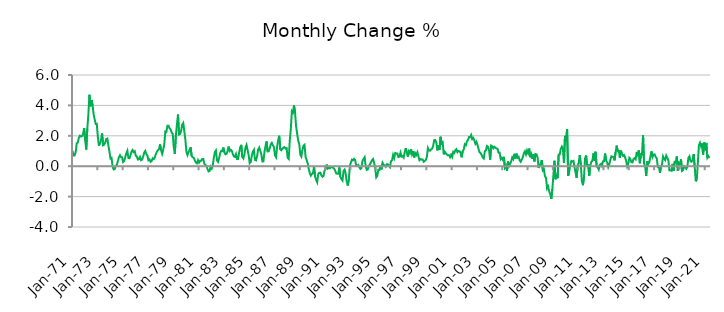
| Category | Series 0 |
|---|---|
| 1971-01-01 | 1.014 |
| 1971-02-01 | 0.711 |
| 1971-03-01 | 0.712 |
| 1971-04-01 | 0.919 |
| 1971-05-01 | 1.51 |
| 1971-06-01 | 1.551 |
| 1971-07-01 | 1.878 |
| 1971-08-01 | 2.005 |
| 1971-09-01 | 1.95 |
| 1971-10-01 | 1.987 |
| 1971-11-01 | 2.104 |
| 1971-12-01 | 2.509 |
| 1972-01-01 | 1.699 |
| 1972-02-01 | 1.094 |
| 1972-03-01 | 2.462 |
| 1972-04-01 | 3.36 |
| 1972-05-01 | 4.697 |
| 1972-06-01 | 3.937 |
| 1972-07-01 | 4.355 |
| 1972-08-01 | 4.026 |
| 1972-09-01 | 3.417 |
| 1972-10-01 | 3.088 |
| 1972-11-01 | 2.774 |
| 1972-12-01 | 2.784 |
| 1973-01-01 | 1.938 |
| 1973-02-01 | 1.343 |
| 1973-03-01 | 1.524 |
| 1973-04-01 | 1.712 |
| 1973-05-01 | 2.158 |
| 1973-06-01 | 1.373 |
| 1973-07-01 | 1.418 |
| 1973-08-01 | 1.551 |
| 1973-09-01 | 1.782 |
| 1973-10-01 | 1.816 |
| 1973-11-01 | 1.359 |
| 1973-12-01 | 0.961 |
| 1974-01-01 | 0.511 |
| 1974-02-01 | 0.548 |
| 1974-03-01 | -0.022 |
| 1974-04-01 | -0.216 |
| 1974-05-01 | -0.191 |
| 1974-06-01 | 0.007 |
| 1974-07-01 | 0.097 |
| 1974-08-01 | 0.326 |
| 1974-09-01 | 0.591 |
| 1974-10-01 | 0.722 |
| 1974-11-01 | 0.594 |
| 1974-12-01 | 0.583 |
| 1975-01-01 | 0.268 |
| 1975-02-01 | 0.337 |
| 1975-03-01 | 0.597 |
| 1975-04-01 | 0.845 |
| 1975-05-01 | 1.017 |
| 1975-06-01 | 0.539 |
| 1975-07-01 | 0.526 |
| 1975-08-01 | 0.722 |
| 1975-09-01 | 0.97 |
| 1975-10-01 | 1.067 |
| 1975-11-01 | 0.93 |
| 1975-12-01 | 0.985 |
| 1976-01-01 | 0.687 |
| 1976-02-01 | 0.643 |
| 1976-03-01 | 0.437 |
| 1976-04-01 | 0.463 |
| 1976-05-01 | 0.603 |
| 1976-06-01 | 0.392 |
| 1976-07-01 | 0.432 |
| 1976-08-01 | 0.636 |
| 1976-09-01 | 0.905 |
| 1976-10-01 | 1.011 |
| 1976-11-01 | 0.8 |
| 1976-12-01 | 0.709 |
| 1977-01-01 | 0.392 |
| 1977-02-01 | 0.448 |
| 1977-03-01 | 0.289 |
| 1977-04-01 | 0.338 |
| 1977-05-01 | 0.521 |
| 1977-06-01 | 0.47 |
| 1977-07-01 | 0.575 |
| 1977-08-01 | 0.784 |
| 1977-09-01 | 0.951 |
| 1977-10-01 | 1.061 |
| 1977-11-01 | 1.111 |
| 1977-12-01 | 1.434 |
| 1978-01-01 | 1.05 |
| 1978-02-01 | 0.811 |
| 1978-03-01 | 1.084 |
| 1978-04-01 | 1.443 |
| 1978-05-01 | 2.28 |
| 1978-06-01 | 2.255 |
| 1978-07-01 | 2.668 |
| 1978-08-01 | 2.665 |
| 1978-09-01 | 2.498 |
| 1978-10-01 | 2.424 |
| 1978-11-01 | 2.207 |
| 1978-12-01 | 2.133 |
| 1979-01-01 | 1.242 |
| 1979-02-01 | 0.823 |
| 1979-03-01 | 2.034 |
| 1979-04-01 | 2.732 |
| 1979-05-01 | 3.394 |
| 1979-06-01 | 2.083 |
| 1979-07-01 | 2.118 |
| 1979-08-01 | 2.335 |
| 1979-09-01 | 2.734 |
| 1979-10-01 | 2.841 |
| 1979-11-01 | 2.3 |
| 1979-12-01 | 1.747 |
| 1980-01-01 | 0.943 |
| 1980-02-01 | 0.726 |
| 1980-03-01 | 0.925 |
| 1980-04-01 | 1.073 |
| 1980-05-01 | 1.242 |
| 1980-06-01 | 0.656 |
| 1980-07-01 | 0.591 |
| 1980-08-01 | 0.543 |
| 1980-09-01 | 0.381 |
| 1980-10-01 | 0.243 |
| 1980-11-01 | 0.186 |
| 1980-12-01 | 0.395 |
| 1981-01-01 | 0.234 |
| 1981-02-01 | 0.354 |
| 1981-03-01 | 0.354 |
| 1981-04-01 | 0.474 |
| 1981-05-01 | 0.478 |
| 1981-06-01 | 0.161 |
| 1981-07-01 | 0.077 |
| 1981-08-01 | 0.019 |
| 1981-09-01 | -0.188 |
| 1981-10-01 | -0.344 |
| 1981-11-01 | -0.317 |
| 1981-12-01 | -0.035 |
| 1982-01-01 | -0.155 |
| 1982-02-01 | 0.068 |
| 1982-03-01 | 0.555 |
| 1982-04-01 | 0.929 |
| 1982-05-01 | 1.031 |
| 1982-06-01 | 0.372 |
| 1982-07-01 | 0.28 |
| 1982-08-01 | 0.532 |
| 1982-09-01 | 0.859 |
| 1982-10-01 | 1.012 |
| 1982-11-01 | 0.998 |
| 1982-12-01 | 1.225 |
| 1983-01-01 | 0.92 |
| 1983-02-01 | 0.783 |
| 1983-03-01 | 0.81 |
| 1983-04-01 | 0.995 |
| 1983-05-01 | 1.293 |
| 1983-06-01 | 1.001 |
| 1983-07-01 | 1.08 |
| 1983-08-01 | 1.015 |
| 1983-09-01 | 0.803 |
| 1983-10-01 | 0.652 |
| 1983-11-01 | 0.611 |
| 1983-12-01 | 0.798 |
| 1984-01-01 | 0.473 |
| 1984-02-01 | 0.478 |
| 1984-03-01 | 0.903 |
| 1984-04-01 | 1.241 |
| 1984-05-01 | 1.404 |
| 1984-06-01 | 0.614 |
| 1984-07-01 | 0.511 |
| 1984-08-01 | 0.774 |
| 1984-09-01 | 1.225 |
| 1984-10-01 | 1.401 |
| 1984-11-01 | 1.068 |
| 1984-12-01 | 0.734 |
| 1985-01-01 | 0.202 |
| 1985-02-01 | 0.279 |
| 1985-03-01 | 0.684 |
| 1985-04-01 | 0.954 |
| 1985-05-01 | 1.079 |
| 1985-06-01 | 0.413 |
| 1985-07-01 | 0.38 |
| 1985-08-01 | 0.656 |
| 1985-09-01 | 1.087 |
| 1985-10-01 | 1.228 |
| 1985-11-01 | 1.02 |
| 1985-12-01 | 0.807 |
| 1986-01-01 | 0.311 |
| 1986-02-01 | 0.317 |
| 1986-03-01 | 0.923 |
| 1986-04-01 | 1.322 |
| 1986-05-01 | 1.629 |
| 1986-06-01 | 0.97 |
| 1986-07-01 | 0.982 |
| 1986-08-01 | 1.161 |
| 1986-09-01 | 1.443 |
| 1986-10-01 | 1.536 |
| 1986-11-01 | 1.373 |
| 1986-12-01 | 1.263 |
| 1987-01-01 | 0.724 |
| 1987-02-01 | 0.595 |
| 1987-03-01 | 1.283 |
| 1987-04-01 | 1.705 |
| 1987-05-01 | 2.003 |
| 1987-06-01 | 1.108 |
| 1987-07-01 | 1.049 |
| 1987-08-01 | 1.142 |
| 1987-09-01 | 1.226 |
| 1987-10-01 | 1.253 |
| 1987-11-01 | 1.16 |
| 1987-12-01 | 1.188 |
| 1988-01-01 | 0.558 |
| 1988-02-01 | 0.478 |
| 1988-03-01 | 1.666 |
| 1988-04-01 | 2.466 |
| 1988-05-01 | 3.62 |
| 1988-06-01 | 3.526 |
| 1988-07-01 | 4.01 |
| 1988-08-01 | 3.546 |
| 1988-09-01 | 2.637 |
| 1988-10-01 | 2.133 |
| 1988-11-01 | 1.68 |
| 1988-12-01 | 1.467 |
| 1989-01-01 | 0.756 |
| 1989-02-01 | 0.634 |
| 1989-03-01 | 1.069 |
| 1989-04-01 | 1.347 |
| 1989-05-01 | 1.408 |
| 1989-06-01 | 0.607 |
| 1989-07-01 | 0.411 |
| 1989-08-01 | 0.192 |
| 1989-09-01 | -0.165 |
| 1989-10-01 | -0.462 |
| 1989-11-01 | -0.618 |
| 1989-12-01 | -0.507 |
| 1990-01-01 | -0.459 |
| 1990-02-01 | -0.019 |
| 1990-03-01 | -0.686 |
| 1990-04-01 | -0.897 |
| 1990-05-01 | -1.058 |
| 1990-06-01 | -0.51 |
| 1990-07-01 | -0.437 |
| 1990-08-01 | -0.428 |
| 1990-09-01 | -0.604 |
| 1990-10-01 | -0.695 |
| 1990-11-01 | -0.649 |
| 1990-12-01 | -0.278 |
| 1991-01-01 | -0.196 |
| 1991-02-01 | 0.105 |
| 1991-03-01 | -0.159 |
| 1991-04-01 | -0.105 |
| 1991-05-01 | -0.139 |
| 1991-06-01 | -0.062 |
| 1991-07-01 | -0.066 |
| 1991-08-01 | -0.093 |
| 1991-09-01 | -0.159 |
| 1991-10-01 | -0.285 |
| 1991-11-01 | -0.467 |
| 1991-12-01 | -0.497 |
| 1992-01-01 | -0.494 |
| 1992-02-01 | -0.076 |
| 1992-03-01 | -0.697 |
| 1992-04-01 | -0.848 |
| 1992-05-01 | -0.944 |
| 1992-06-01 | -0.312 |
| 1992-07-01 | -0.225 |
| 1992-08-01 | -0.473 |
| 1992-09-01 | -1.015 |
| 1992-10-01 | -1.272 |
| 1992-11-01 | -0.873 |
| 1992-12-01 | 0.026 |
| 1993-01-01 | 0.247 |
| 1993-02-01 | 0.437 |
| 1993-03-01 | 0.391 |
| 1993-04-01 | 0.487 |
| 1993-05-01 | 0.413 |
| 1993-06-01 | 0.047 |
| 1993-07-01 | 0.03 |
| 1993-08-01 | 0.082 |
| 1993-09-01 | -0.063 |
| 1993-10-01 | -0.18 |
| 1993-11-01 | -0.118 |
| 1993-12-01 | 0.35 |
| 1994-01-01 | 0.48 |
| 1994-02-01 | 0.595 |
| 1994-03-01 | -0.023 |
| 1994-04-01 | -0.241 |
| 1994-05-01 | -0.212 |
| 1994-06-01 | 0.019 |
| 1994-07-01 | 0.12 |
| 1994-08-01 | 0.247 |
| 1994-09-01 | 0.391 |
| 1994-10-01 | 0.472 |
| 1994-11-01 | 0.222 |
| 1994-12-01 | -0.131 |
| 1995-01-01 | -0.733 |
| 1995-02-01 | -0.635 |
| 1995-03-01 | -0.24 |
| 1995-04-01 | -0.251 |
| 1995-05-01 | 0.043 |
| 1995-06-01 | -0.212 |
| 1995-07-01 | 0.218 |
| 1995-08-01 | 0.097 |
| 1995-09-01 | 0.057 |
| 1995-10-01 | -0.036 |
| 1995-11-01 | 0.126 |
| 1995-12-01 | 0.123 |
| 1996-01-01 | 0.036 |
| 1996-02-01 | -0.061 |
| 1996-03-01 | 0.33 |
| 1996-04-01 | 0.389 |
| 1996-05-01 | 0.736 |
| 1996-06-01 | 0.535 |
| 1996-07-01 | 0.868 |
| 1996-08-01 | 0.833 |
| 1996-09-01 | 0.834 |
| 1996-10-01 | 0.603 |
| 1996-11-01 | 0.635 |
| 1996-12-01 | 0.892 |
| 1997-01-01 | 0.634 |
| 1997-02-01 | 0.672 |
| 1997-03-01 | 0.57 |
| 1997-04-01 | 0.919 |
| 1997-05-01 | 1.19 |
| 1997-06-01 | 0.893 |
| 1997-07-01 | 0.625 |
| 1997-08-01 | 0.99 |
| 1997-09-01 | 0.877 |
| 1997-10-01 | 1.126 |
| 1997-11-01 | 0.779 |
| 1997-12-01 | 0.981 |
| 1998-01-01 | 0.576 |
| 1998-02-01 | 0.861 |
| 1998-03-01 | 0.744 |
| 1998-04-01 | 0.917 |
| 1998-05-01 | 0.646 |
| 1998-06-01 | 0.394 |
| 1998-07-01 | 0.47 |
| 1998-08-01 | 0.438 |
| 1998-09-01 | 0.441 |
| 1998-10-01 | 0.291 |
| 1998-11-01 | 0.339 |
| 1998-12-01 | 0.406 |
| 1999-01-01 | 0.599 |
| 1999-02-01 | 1.189 |
| 1999-03-01 | 1.036 |
| 1999-04-01 | 1.017 |
| 1999-05-01 | 1.102 |
| 1999-06-01 | 1.154 |
| 1999-07-01 | 1.343 |
| 1999-08-01 | 1.715 |
| 1999-09-01 | 1.719 |
| 1999-10-01 | 1.552 |
| 1999-11-01 | 1.038 |
| 1999-12-01 | 1.38 |
| 2000-01-01 | 1.085 |
| 2000-02-01 | 1.936 |
| 2000-03-01 | 1.491 |
| 2000-04-01 | 1.566 |
| 2000-05-01 | 0.781 |
| 2000-06-01 | 0.949 |
| 2000-07-01 | 0.839 |
| 2000-08-01 | 0.775 |
| 2000-09-01 | 0.714 |
| 2000-10-01 | 0.729 |
| 2000-11-01 | 0.596 |
| 2000-12-01 | 0.754 |
| 2001-01-01 | 0.606 |
| 2001-02-01 | 0.935 |
| 2001-03-01 | 0.867 |
| 2001-04-01 | 1.055 |
| 2001-05-01 | 1.127 |
| 2001-06-01 | 0.924 |
| 2001-07-01 | 0.998 |
| 2001-08-01 | 0.985 |
| 2001-09-01 | 0.883 |
| 2001-10-01 | 0.588 |
| 2001-11-01 | 0.997 |
| 2001-12-01 | 1.094 |
| 2002-01-01 | 1.445 |
| 2002-02-01 | 1.384 |
| 2002-03-01 | 1.631 |
| 2002-04-01 | 1.728 |
| 2002-05-01 | 1.918 |
| 2002-06-01 | 1.906 |
| 2002-07-01 | 2.048 |
| 2002-08-01 | 1.783 |
| 2002-09-01 | 1.859 |
| 2002-10-01 | 1.71 |
| 2002-11-01 | 1.477 |
| 2002-12-01 | 1.602 |
| 2003-01-01 | 1.407 |
| 2003-02-01 | 1.139 |
| 2003-03-01 | 0.91 |
| 2003-04-01 | 0.863 |
| 2003-05-01 | 0.726 |
| 2003-06-01 | 0.579 |
| 2003-07-01 | 0.508 |
| 2003-08-01 | 0.993 |
| 2003-09-01 | 1.027 |
| 2003-10-01 | 1.329 |
| 2003-11-01 | 1.273 |
| 2003-12-01 | 1.053 |
| 2004-01-01 | 0.433 |
| 2004-02-01 | 1.358 |
| 2004-03-01 | 1.317 |
| 2004-04-01 | 1.179 |
| 2004-05-01 | 1.278 |
| 2004-06-01 | 1.218 |
| 2004-07-01 | 1.163 |
| 2004-08-01 | 1.146 |
| 2004-09-01 | 0.887 |
| 2004-10-01 | 0.892 |
| 2004-11-01 | 0.464 |
| 2004-12-01 | 0.546 |
| 2005-01-01 | 0.433 |
| 2005-02-01 | 0.615 |
| 2005-03-01 | -0.094 |
| 2005-04-01 | 0.035 |
| 2005-05-01 | -0.308 |
| 2005-06-01 | 0.31 |
| 2005-07-01 | 0.014 |
| 2005-08-01 | 0.163 |
| 2005-09-01 | 0.324 |
| 2005-10-01 | 0.577 |
| 2005-11-01 | 0.466 |
| 2005-12-01 | 0.812 |
| 2006-01-01 | 0.5 |
| 2006-02-01 | 0.828 |
| 2006-03-01 | 0.563 |
| 2006-04-01 | 0.621 |
| 2006-05-01 | 0.386 |
| 2006-06-01 | 0.291 |
| 2006-07-01 | 0.438 |
| 2006-08-01 | 0.591 |
| 2006-09-01 | 0.848 |
| 2006-10-01 | 0.979 |
| 2006-11-01 | 0.775 |
| 2006-12-01 | 1.037 |
| 2007-01-01 | 0.858 |
| 2007-02-01 | 1.157 |
| 2007-03-01 | 0.591 |
| 2007-04-01 | 0.791 |
| 2007-05-01 | 0.495 |
| 2007-06-01 | 0.773 |
| 2007-07-01 | 0.314 |
| 2007-08-01 | 0.802 |
| 2007-09-01 | 0.779 |
| 2007-10-01 | 0.566 |
| 2007-11-01 | -0.121 |
| 2007-12-01 | 0.07 |
| 2008-01-01 | 0.193 |
| 2008-02-01 | 0.407 |
| 2008-03-01 | -0.27 |
| 2008-04-01 | -0.198 |
| 2008-05-01 | -0.666 |
| 2008-06-01 | -0.763 |
| 2008-07-01 | -1.456 |
| 2008-08-01 | -1.333 |
| 2008-09-01 | -1.666 |
| 2008-10-01 | -1.827 |
| 2008-11-01 | -2.152 |
| 2008-12-01 | -1.511 |
| 2009-01-01 | -0.593 |
| 2009-02-01 | 0.356 |
| 2009-03-01 | -0.862 |
| 2009-04-01 | -0.536 |
| 2009-05-01 | -0.786 |
| 2009-06-01 | 0.762 |
| 2009-07-01 | 0.77 |
| 2009-08-01 | 1.139 |
| 2009-09-01 | 1.284 |
| 2009-10-01 | 1.145 |
| 2009-11-01 | 0.204 |
| 2009-12-01 | 1.994 |
| 2010-01-01 | 1.613 |
| 2010-02-01 | 2.445 |
| 2010-03-01 | -0.631 |
| 2010-04-01 | -0.337 |
| 2010-05-01 | 0.08 |
| 2010-06-01 | 0.344 |
| 2010-07-01 | 0.307 |
| 2010-08-01 | 0.345 |
| 2010-09-01 | -0.055 |
| 2010-10-01 | -0.41 |
| 2010-11-01 | -0.762 |
| 2010-12-01 | 0.039 |
| 2011-01-01 | 0.213 |
| 2011-02-01 | 0.73 |
| 2011-03-01 | 0.086 |
| 2011-04-01 | -0.954 |
| 2011-05-01 | -1.249 |
| 2011-06-01 | -0.74 |
| 2011-07-01 | 0.505 |
| 2011-08-01 | 0.701 |
| 2011-09-01 | -0.047 |
| 2011-10-01 | 0.117 |
| 2011-11-01 | -0.617 |
| 2011-12-01 | 0.055 |
| 2012-01-01 | 0.295 |
| 2012-02-01 | 0.36 |
| 2012-03-01 | 0.843 |
| 2012-04-01 | 0.364 |
| 2012-05-01 | 0.952 |
| 2012-06-01 | -0.019 |
| 2012-07-01 | -0.072 |
| 2012-08-01 | -0.223 |
| 2012-09-01 | 0.09 |
| 2012-10-01 | 0.146 |
| 2012-11-01 | 0.01 |
| 2012-12-01 | 0.315 |
| 2013-01-01 | 0.332 |
| 2013-02-01 | 0.833 |
| 2013-03-01 | 0.377 |
| 2013-04-01 | 0.245 |
| 2013-05-01 | -0.058 |
| 2013-06-01 | 0.126 |
| 2013-07-01 | 0.41 |
| 2013-08-01 | 0.651 |
| 2013-09-01 | 0.62 |
| 2013-10-01 | 0.603 |
| 2013-11-01 | 0.38 |
| 2013-12-01 | 0.926 |
| 2014-01-01 | 1.351 |
| 2014-02-01 | 0.99 |
| 2014-03-01 | 1.002 |
| 2014-04-01 | 0.559 |
| 2014-05-01 | 1.028 |
| 2014-06-01 | 0.79 |
| 2014-07-01 | 0.675 |
| 2014-08-01 | 0.734 |
| 2014-09-01 | 0.578 |
| 2014-10-01 | 0.359 |
| 2014-11-01 | -0.016 |
| 2014-12-01 | 0.161 |
| 2015-01-01 | 0.547 |
| 2015-02-01 | 0.467 |
| 2015-03-01 | 0.257 |
| 2015-04-01 | 0.25 |
| 2015-05-01 | 0.484 |
| 2015-06-01 | 0.532 |
| 2015-07-01 | 0.454 |
| 2015-08-01 | 0.94 |
| 2015-09-01 | 0.754 |
| 2015-10-01 | 1.045 |
| 2015-11-01 | 0.196 |
| 2015-12-01 | 0.79 |
| 2016-01-01 | 0.777 |
| 2016-02-01 | 2.042 |
| 2016-03-01 | 0.162 |
| 2016-04-01 | 0.005 |
| 2016-05-01 | -0.638 |
| 2016-06-01 | 0.315 |
| 2016-07-01 | 0.149 |
| 2016-08-01 | 0.276 |
| 2016-09-01 | 0.638 |
| 2016-10-01 | 0.971 |
| 2016-11-01 | 0.611 |
| 2016-12-01 | 0.773 |
| 2017-01-01 | 0.778 |
| 2017-02-01 | 0.608 |
| 2017-03-01 | 0.525 |
| 2017-04-01 | -0.033 |
| 2017-05-01 | -0.003 |
| 2017-06-01 | -0.431 |
| 2017-07-01 | -0.06 |
| 2017-08-01 | 0.117 |
| 2017-09-01 | 0.643 |
| 2017-10-01 | 0.49 |
| 2017-11-01 | 0.401 |
| 2017-12-01 | 0.694 |
| 2018-01-01 | 0.543 |
| 2018-02-01 | 0.408 |
| 2018-03-01 | -0.275 |
| 2018-04-01 | -0.266 |
| 2018-05-01 | -0.302 |
| 2018-06-01 | 0.152 |
| 2018-07-01 | -0.316 |
| 2018-08-01 | 0.283 |
| 2018-09-01 | 0.257 |
| 2018-10-01 | 0.643 |
| 2018-11-01 | -0.297 |
| 2018-12-01 | 0.233 |
| 2019-01-01 | 0.149 |
| 2019-02-01 | 0.449 |
| 2019-03-01 | -0.311 |
| 2019-04-01 | -0.253 |
| 2019-05-01 | -0.005 |
| 2019-06-01 | -0.066 |
| 2019-07-01 | -0.17 |
| 2019-08-01 | -0.053 |
| 2019-09-01 | 0.55 |
| 2019-10-01 | 0.654 |
| 2019-11-01 | 0.326 |
| 2019-12-01 | 0.295 |
| 2020-01-01 | 0.435 |
| 2020-02-01 | 0.798 |
| 2020-03-01 | -0.032 |
| 2020-04-01 | -0.994 |
| 2020-05-01 | -0.839 |
| 2020-06-01 | 0.239 |
| 2020-07-01 | 1.378 |
| 2020-08-01 | 1.544 |
| 2020-09-01 | 1.312 |
| 2020-10-01 | 1.491 |
| 2020-11-01 | 0.772 |
| 2020-12-01 | 1.564 |
| 2021-01-01 | 1.05 |
| 2021-02-01 | 1.532 |
| 2021-03-01 | 0.554 |
| 2021-04-01 | 0.661 |
| 2021-05-01 | 0.537 |